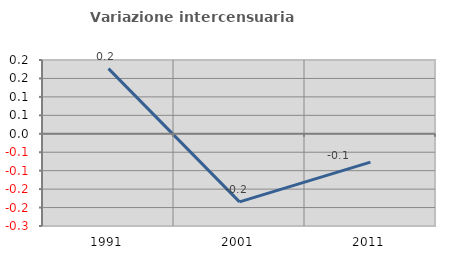
| Category | Variazione intercensuaria annua |
|---|---|
| 1991.0 | 0.177 |
| 2001.0 | -0.185 |
| 2011.0 | -0.077 |